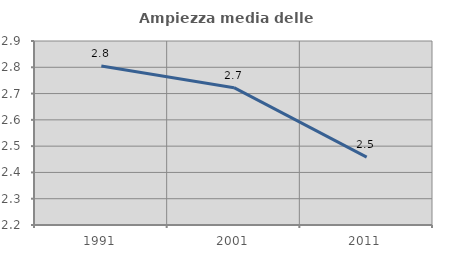
| Category | Ampiezza media delle famiglie |
|---|---|
| 1991.0 | 2.805 |
| 2001.0 | 2.722 |
| 2011.0 | 2.458 |